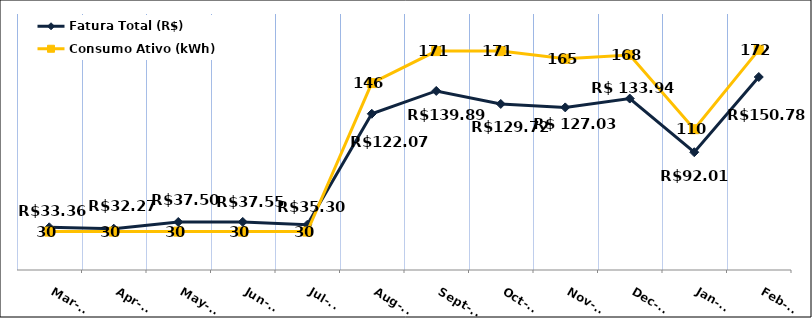
| Category | Fatura Total (R$) |
|---|---|
| 2022-03-01 | 33.36 |
| 2022-04-01 | 32.27 |
| 2022-05-01 | 37.5 |
| 2022-06-01 | 37.55 |
| 2022-07-01 | 35.3 |
| 2022-08-01 | 122.07 |
| 2022-09-01 | 139.89 |
| 2022-10-01 | 129.72 |
| 2022-11-01 | 127.03 |
| 2022-12-01 | 133.94 |
| 2023-01-01 | 92.01 |
| 2023-02-01 | 150.78 |